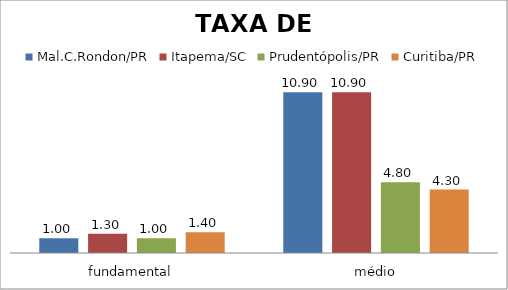
| Category | Mal.C.Rondon/PR | Itapema/SC | Prudentópolis/PR | Toledo/PR | Cascavel/PR | Curitiba/PR |
|---|---|---|---|---|---|---|
| fundamental | 1 | 1.3 | 1 |  |  | 1.4 |
| médio | 10.9 | 10.9 | 4.8 |  |  | 4.3 |